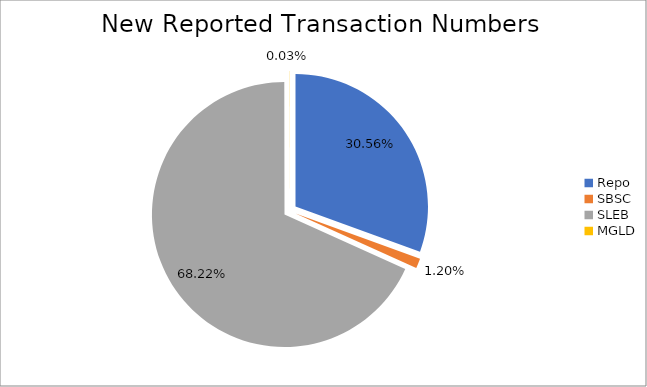
| Category | Series 0 |
|---|---|
| Repo | 279679 |
| SBSC | 10983 |
| SLEB | 624428 |
| MGLD | 230 |